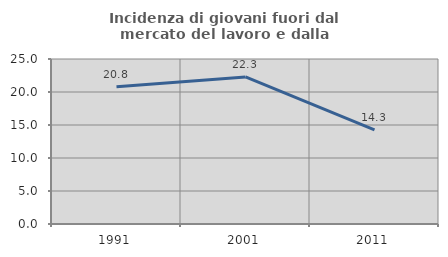
| Category | Incidenza di giovani fuori dal mercato del lavoro e dalla formazione  |
|---|---|
| 1991.0 | 20.81 |
| 2001.0 | 22.287 |
| 2011.0 | 14.254 |